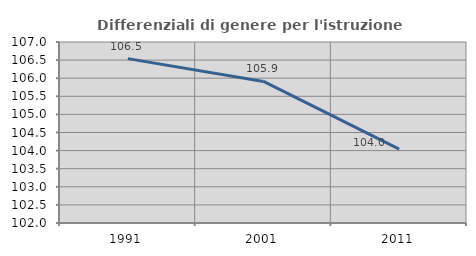
| Category | Differenziali di genere per l'istruzione superiore |
|---|---|
| 1991.0 | 106.541 |
| 2001.0 | 105.911 |
| 2011.0 | 104.038 |